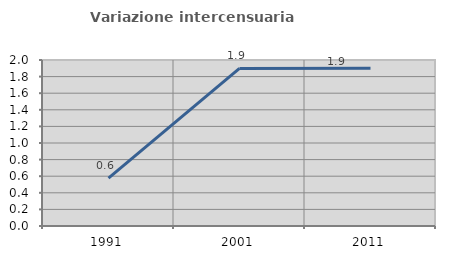
| Category | Variazione intercensuaria annua |
|---|---|
| 1991.0 | 0.577 |
| 2001.0 | 1.898 |
| 2011.0 | 1.9 |